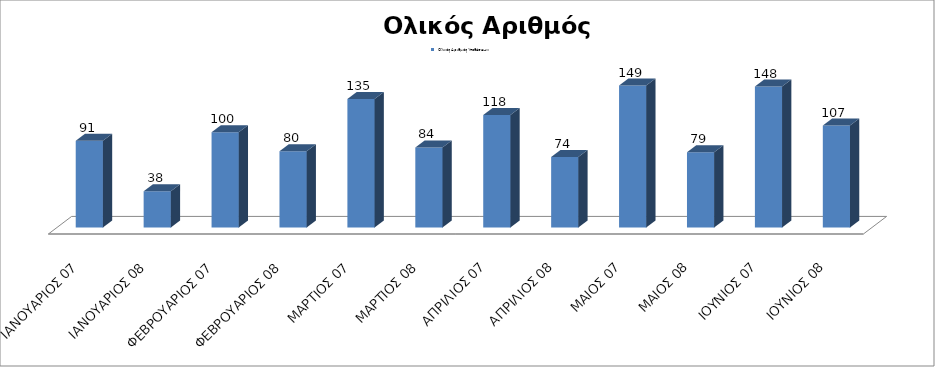
| Category | Ολικός Αριθμός Υποθέσεων: |
|---|---|
| ΙΑΝΟΥΑΡΙΟΣ 07 | 91 |
| ΙΑΝΟΥΑΡΙΟΣ 08 | 38 |
| ΦΕΒΡΟΥΑΡΙΟΣ 07 | 100 |
| ΦΕΒΡΟΥΑΡΙΟΣ 08 | 80 |
| ΜΑΡΤΙΟΣ 07 | 135 |
| ΜΑΡΤΙΟΣ 08 | 84 |
| ΑΠΡΙΛΙΟΣ 07 | 118 |
| ΑΠΡΙΛΙΟΣ 08 | 74 |
| ΜΑΙΟΣ 07 | 149 |
| ΜΑΙΟΣ 08 | 79 |
| ΙΟΥΝΙΟΣ 07 | 148 |
| ΙΟΥΝΙΟΣ 08 | 107 |